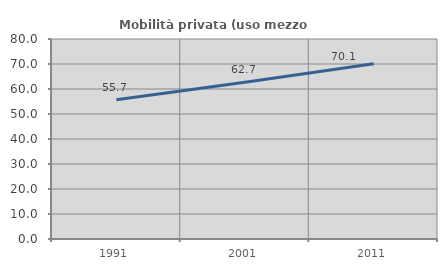
| Category | Mobilità privata (uso mezzo privato) |
|---|---|
| 1991.0 | 55.677 |
| 2001.0 | 62.74 |
| 2011.0 | 70.067 |